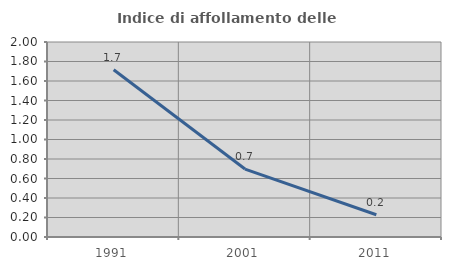
| Category | Indice di affollamento delle abitazioni  |
|---|---|
| 1991.0 | 1.715 |
| 2001.0 | 0.697 |
| 2011.0 | 0.228 |